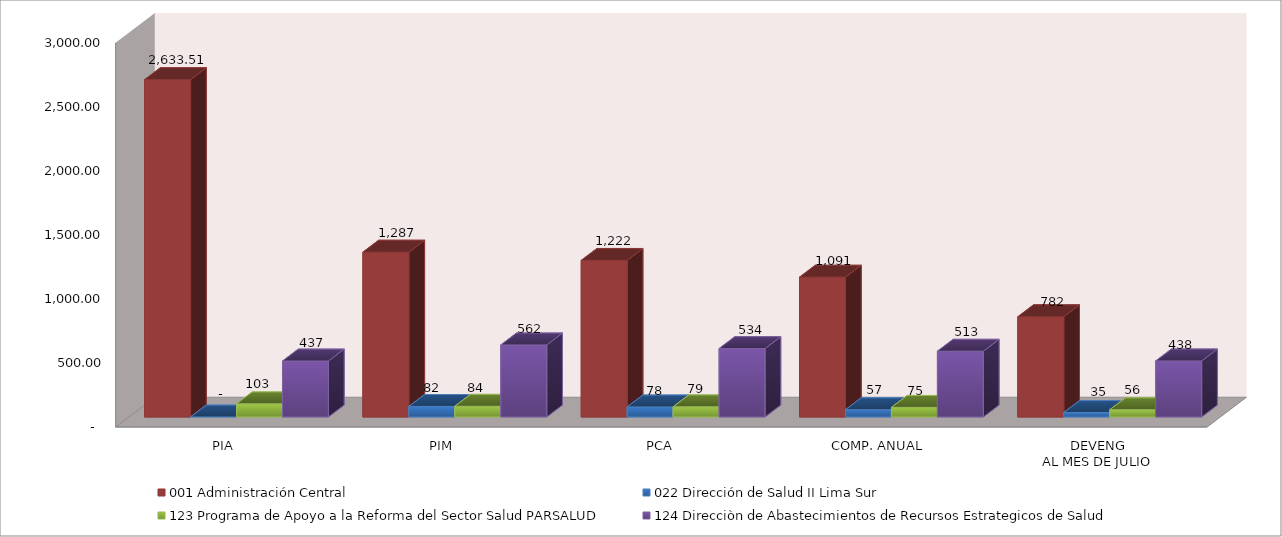
| Category | 001 Administración Central | 022 Dirección de Salud II Lima Sur | 123 Programa de Apoyo a la Reforma del Sector Salud PARSALUD | 124 Direcciòn de Abastecimientos de Recursos Estrategicos de Salud |
|---|---|---|---|---|
| PIA | 2633.509 | 0 | 102.766 | 436.8 |
| PIM | 1286.717 | 82.274 | 83.587 | 562.298 |
| PCA | 1222.381 | 78.16 | 79.407 | 534.183 |
| COMP. ANUAL | 1091.35 | 56.639 | 74.859 | 513.324 |
| DEVENG
AL MES DE JULIO | 782.383 | 34.9 | 56.293 | 437.525 |